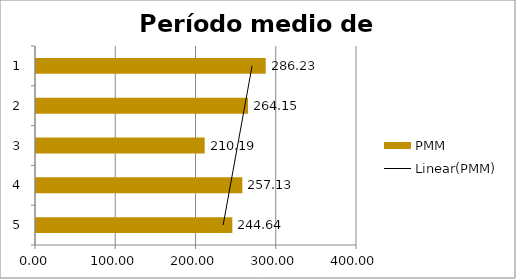
| Category | PMM |
|---|---|
| 5.0 | 244.639 |
| 4.0 | 257.132 |
| 3.0 | 210.193 |
| 2.0 | 264.148 |
| 1.0 | 286.227 |